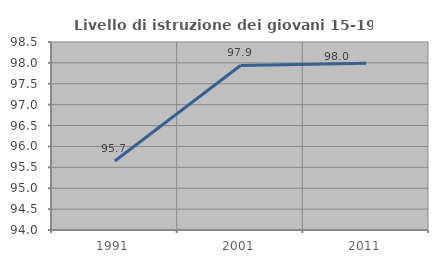
| Category | Livello di istruzione dei giovani 15-19 anni |
|---|---|
| 1991.0 | 95.652 |
| 2001.0 | 97.938 |
| 2011.0 | 97.99 |